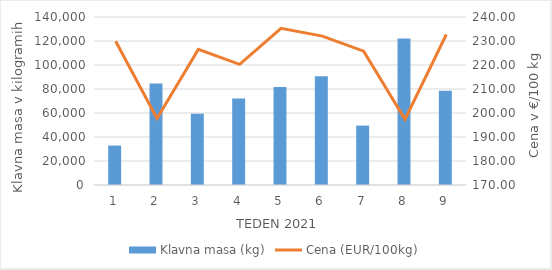
| Category | Klavna masa (kg) |
|---|---|
| 1.0 | 32871 |
| 2.0 | 84639 |
| 3.0 | 59476 |
| 4.0 | 72013 |
| 5.0 | 81759 |
| 6.0 | 90669 |
| 7.0 | 49517 |
| 8.0 | 122111 |
| 9.0 | 78545 |